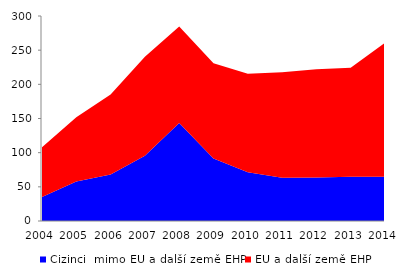
| Category | Cizinci  mimo EU a další země EHP | EU a další země EHP |
|---|---|---|
| 2004.0 | 35.144 | 72.84 |
| 2005.0 | 57.869 | 93.867 |
| 2006.0 | 68.229 | 116.846 |
| 2007.0 | 95.491 | 144.751 |
| 2008.0 | 143.45 | 141.101 |
| 2009.0 | 91.394 | 139.315 |
| 2010.0 | 71.37 | 143.997 |
| 2011.0 | 63.302 | 154.56 |
| 2012.0 | 63.749 | 158.195 |
| 2013.0 | 64.625 | 159.659 |
| 2014.0 | 64.654 | 196.345 |